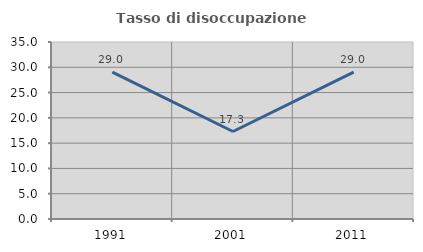
| Category | Tasso di disoccupazione giovanile  |
|---|---|
| 1991.0 | 29.027 |
| 2001.0 | 17.298 |
| 2011.0 | 29.046 |